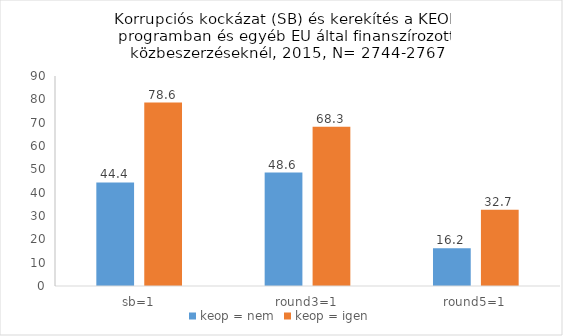
| Category | keop = nem | keop = igen |
|---|---|---|
| sb=1 | 44.4 | 78.6 |
| round3=1 | 48.6 | 68.3 |
| round5=1 | 16.2 | 32.7 |